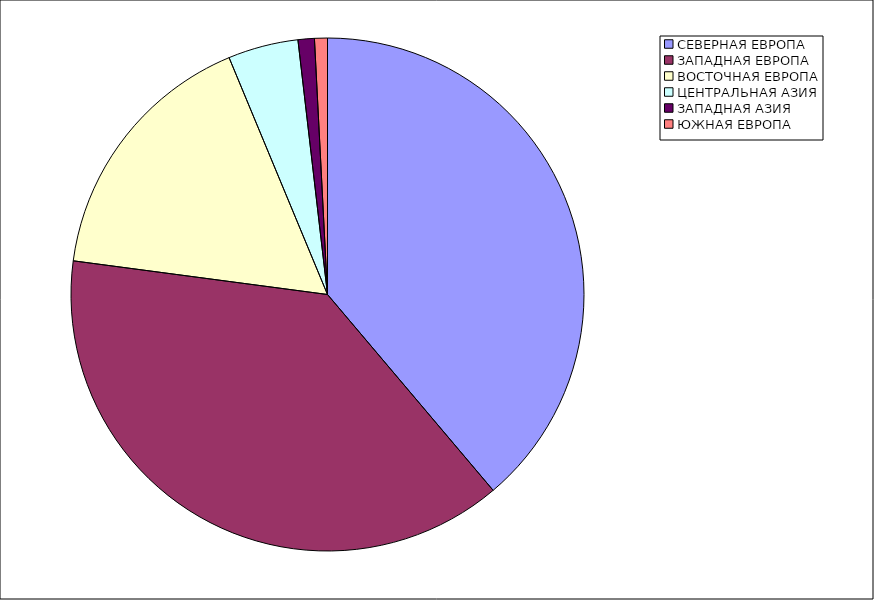
| Category | Оборот |
|---|---|
| СЕВЕРНАЯ ЕВРОПА | 38.826 |
| ЗАПАДНАЯ ЕВРОПА | 38.272 |
| ВОСТОЧНАЯ ЕВРОПА | 16.634 |
| ЦЕНТРАЛЬНАЯ АЗИЯ | 4.428 |
| ЗАПАДНАЯ АЗИЯ | 1.029 |
| ЮЖНАЯ ЕВРОПА | 0.812 |